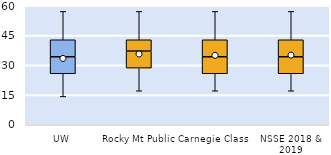
| Category | 25th | 50th | 75th |
|---|---|---|---|
| UW | 25.714 | 8.571 | 8.571 |
| Rocky Mt Public | 28.571 | 8.571 | 5.714 |
| Carnegie Class | 25.714 | 8.571 | 8.571 |
| NSSE 2018 & 2019 | 25.714 | 8.571 | 8.571 |